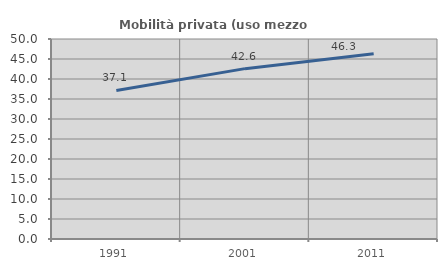
| Category | Mobilità privata (uso mezzo privato) |
|---|---|
| 1991.0 | 37.148 |
| 2001.0 | 42.59 |
| 2011.0 | 46.304 |